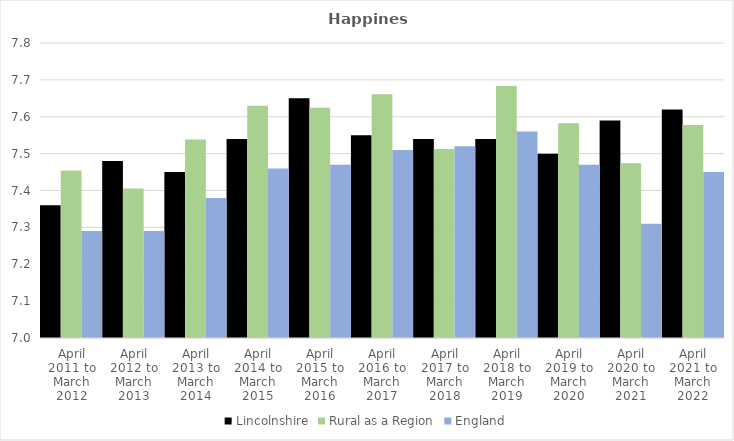
| Category | Lincolnshire | Rural as a Region | England |
|---|---|---|---|
| April 2011 to March 2012 | 7.36 | 7.454 | 7.29 |
| April 2012 to March 2013 | 7.48 | 7.406 | 7.29 |
| April 2013 to March 2014 | 7.45 | 7.539 | 7.38 |
| April 2014 to March 2015 | 7.54 | 7.63 | 7.46 |
| April 2015 to March 2016 | 7.65 | 7.625 | 7.47 |
| April 2016 to March 2017 | 7.55 | 7.661 | 7.51 |
| April 2017 to March 2018 | 7.54 | 7.513 | 7.52 |
| April 2018 to March 2019 | 7.54 | 7.684 | 7.56 |
| April 2019 to March 2020 | 7.5 | 7.582 | 7.47 |
| April 2020 to March 2021 | 7.59 | 7.474 | 7.31 |
| April 2021 to March 2022 | 7.62 | 7.577 | 7.45 |